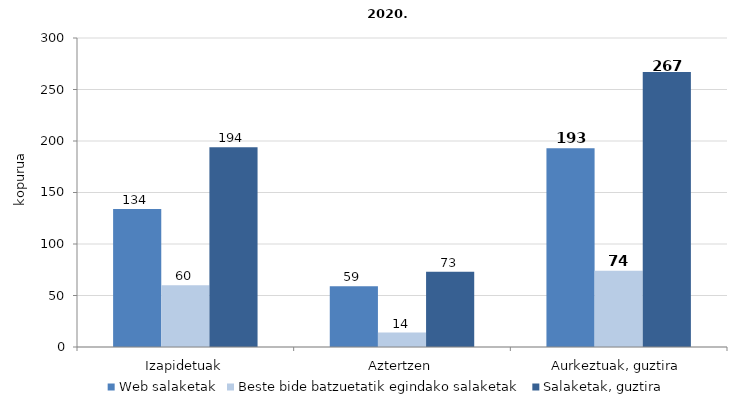
| Category | Web salaketak | Beste bide batzuetatik egindako salaketak | Salaketak, guztira |
|---|---|---|---|
| Izapidetuak | 134 | 60 | 194 |
| Aztertzen | 59 | 14 | 73 |
| Aurkeztuak, guztira | 193 | 74 | 267 |